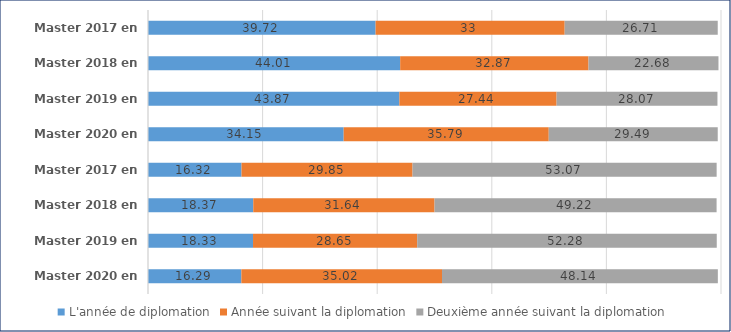
| Category | L'année de diplomation | Année suivant la diplomation | Deuxième année suivant la diplomation |
|---|---|---|---|
| Master 2017 en CDI | 39.72 | 33 | 26.71 |
| Master 2018 en CDI | 44.01 | 32.87 | 22.68 |
| Master 2019 en CDI | 43.87 | 27.44 | 28.07 |
| Master 2020 en CDI | 34.15 | 35.79 | 29.49 |
| Master 2017 en CDD | 16.32 | 29.85 | 53.07 |
| Master 2018 en CDD | 18.37 | 31.64 | 49.22 |
| Master 2019 en CDD | 18.33 | 28.65 | 52.28 |
| Master 2020 en CDD | 16.29 | 35.02 | 48.14 |